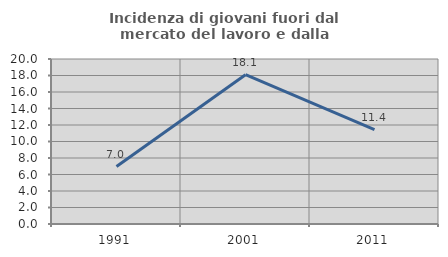
| Category | Incidenza di giovani fuori dal mercato del lavoro e dalla formazione  |
|---|---|
| 1991.0 | 6.965 |
| 2001.0 | 18.101 |
| 2011.0 | 11.448 |